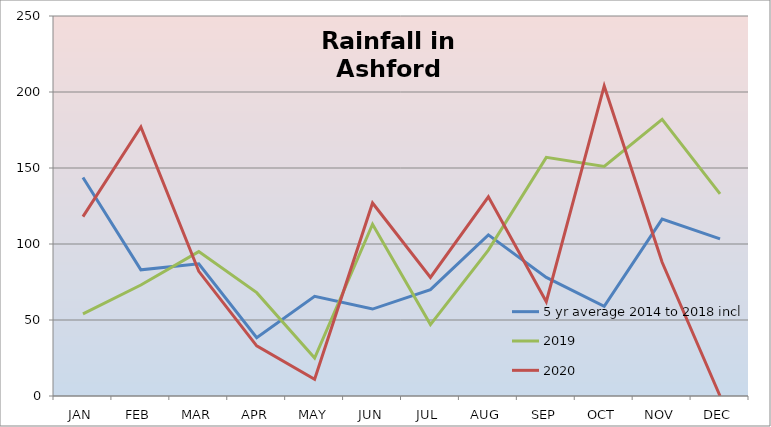
| Category | 5 yr average 2014 to 2018 incl | 2019 | 2020 |
|---|---|---|---|
| JAN | 143.8 | 54 | 118 |
| FEB | 83 | 73 | 177 |
| MAR | 87 | 95 | 82 |
| APR | 38.4 | 68 | 33 |
| MAY | 65.6 | 25 | 11 |
| JUN | 57.2 | 113 | 127 |
| JUL | 70 | 47 | 78 |
| AUG | 106 | 96 | 131 |
| SEP | 78 | 157 | 62 |
| OCT | 59 | 151 | 204 |
| NOV | 116.4 | 182 | 88 |
| DEC | 103.4 | 133 | 0 |